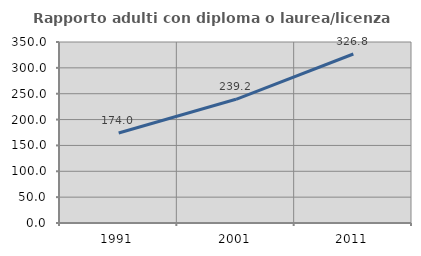
| Category | Rapporto adulti con diploma o laurea/licenza media  |
|---|---|
| 1991.0 | 174.018 |
| 2001.0 | 239.247 |
| 2011.0 | 326.754 |